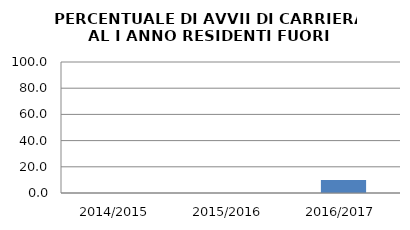
| Category | 2014/2015 2015/2016 2016/2017 |
|---|---|
| 2014/2015 | 0 |
| 2015/2016 | 0 |
| 2016/2017 | 10 |